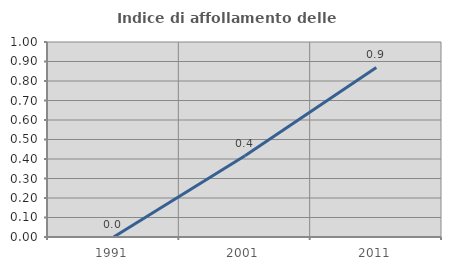
| Category | Indice di affollamento delle abitazioni  |
|---|---|
| 1991.0 | 0 |
| 2001.0 | 0.417 |
| 2011.0 | 0.87 |